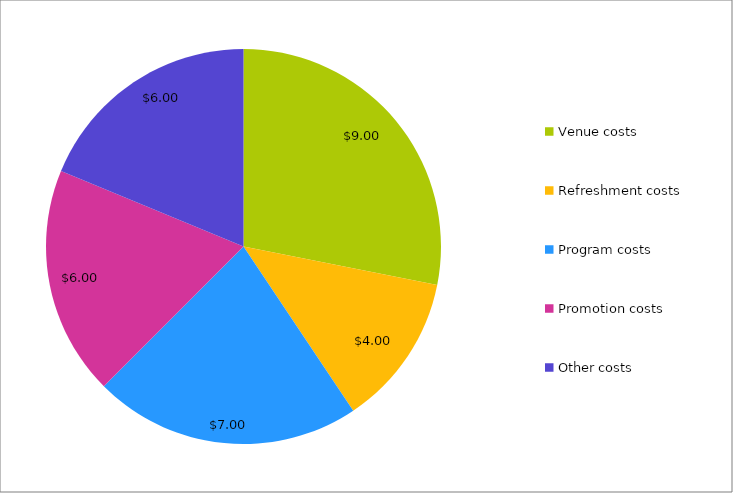
| Category | Series 0 |
|---|---|
| Venue costs | 9 |
| Refreshment costs | 4 |
| Program costs | 7 |
| Promotion costs | 6 |
| Other costs | 6 |